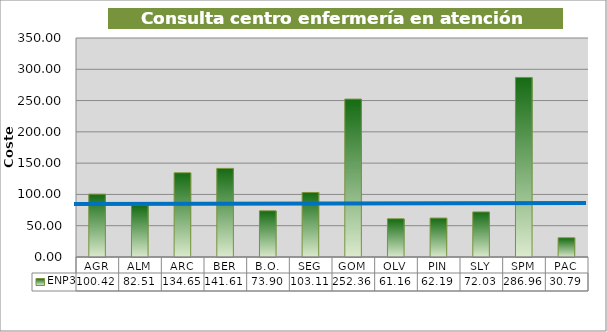
| Category | ENP3 |
|---|---|
| AGR | 100.424 |
| ALM | 82.51 |
| ARC | 134.651 |
| BER | 141.61 |
| B.O. | 73.896 |
| SEG | 103.114 |
| GOM | 252.356 |
| OLV | 61.16 |
| PIN | 62.192 |
| SLY | 72.031 |
| SPM | 286.965 |
| PAC | 30.786 |